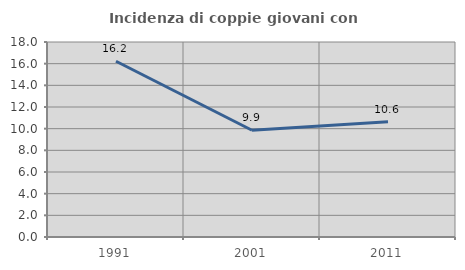
| Category | Incidenza di coppie giovani con figli |
|---|---|
| 1991.0 | 16.226 |
| 2001.0 | 9.854 |
| 2011.0 | 10.631 |